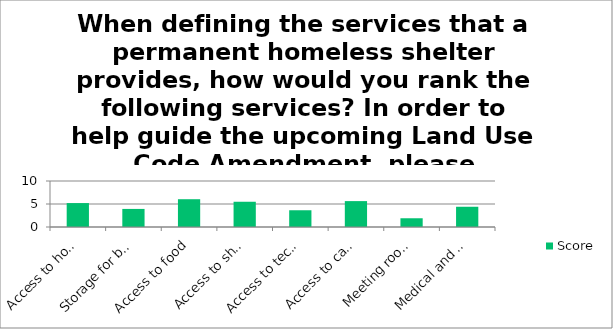
| Category | Score |
|---|---|
| Access to housing year-round | 5.2 |
| Storage for belongings and mail services | 3.93 |
| Access to food | 6.04 |
| Access to showers and laundry | 5.49 |
| Access to technology and workforce training | 3.64 |
| Access to case management, supportive services, mental health counseling or addiction recovery services | 5.63 |
| Meeting rooms | 1.9 |
| Medical and dental assistance | 4.4 |